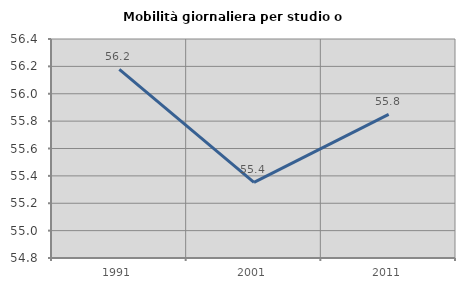
| Category | Mobilità giornaliera per studio o lavoro |
|---|---|
| 1991.0 | 56.178 |
| 2001.0 | 55.352 |
| 2011.0 | 55.849 |